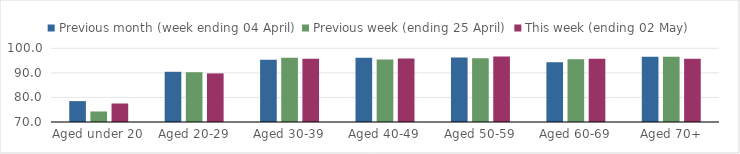
| Category | Previous month (week ending 04 April) | Previous week (ending 25 April) | This week (ending 02 May) |
|---|---|---|---|
| Aged under 20 | 78.498 | 74.286 | 77.531 |
| Aged 20-29 | 90.434 | 90.264 | 89.779 |
| Aged 30-39 | 95.29 | 96.14 | 95.731 |
| Aged 40-49 | 96.114 | 95.434 | 95.868 |
| Aged 50-59 | 96.238 | 95.952 | 96.651 |
| Aged 60-69 | 94.309 | 95.553 | 95.765 |
| Aged 70+ | 96.524 | 96.541 | 95.693 |